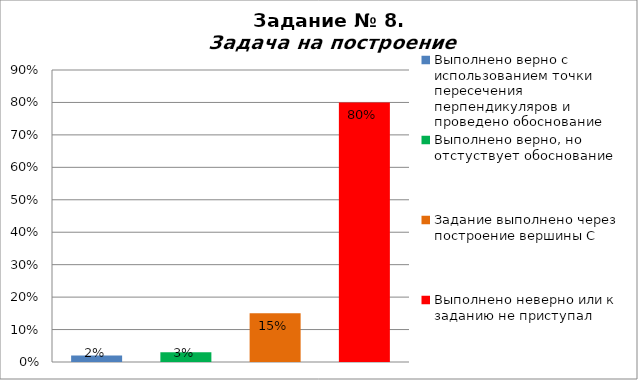
| Category | Задача на построение |
|---|---|
| Выполнено верно с использованием точки пересечения перпендикуляров и проведено обоснование | 0.02 |
| Выполнено верно, но отстуствует обоснование | 0.03 |
| Задание выполнено через построение вершины С | 0.15 |
| Выполнено неверно или к заданию не приступал | 0.8 |